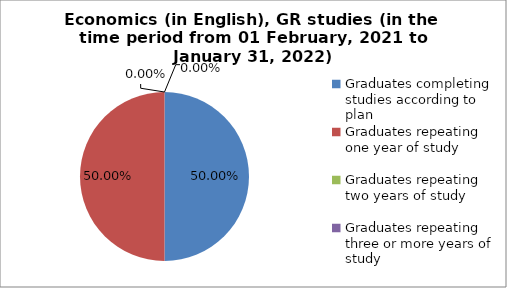
| Category | Series 0 |
|---|---|
| Graduates completing studies according to plan | 50 |
| Graduates repeating one year of study | 50 |
| Graduates repeating two years of study | 0 |
| Graduates repeating three or more years of study | 0 |